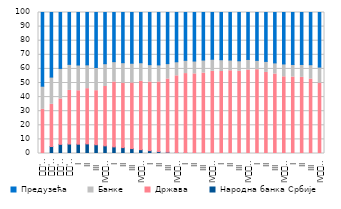
| Category | Народна банка Србије | Држава | Банке | Предузећа |
|---|---|---|---|---|
| 
'08. | 0 | 31.291 | 16.447 | 52.262 |
| 
'09. | 4.984 | 29.887 | 19.325 | 45.804 |
| 
'10. | 6.503 | 32.179 | 21.652 | 39.665 |
| 
'11. | 6.706 | 38.066 | 18.448 | 36.78 |
| I | 6.602 | 37.888 | 18.27 | 37.24 |
| II | 6.814 | 39.174 | 16.883 | 37.129 |
| III | 6.204 | 38.335 | 16.474 | 38.987 |
| IV
2012. | 5.415 | 42.098 | 16.181 | 36.306 |
| I | 4.685 | 46.019 | 14.432 | 34.864 |
| II | 4.172 | 45.685 | 14.545 | 35.598 |
| III | 3.477 | 46.517 | 14.026 | 35.98 |
| IV
2013. | 2.719 | 48.441 | 13.222 | 35.619 |
| I | 2.021 | 48.661 | 12.328 | 36.99 |
| II | 1.323 | 49.383 | 12.132 | 37.162 |
| III | 0.944 | 51.893 | 10.911 | 36.253 |
| IV
2014. | 0.591 | 54.493 | 9.967 | 34.949 |
| I | 0.407 | 56.273 | 9.408 | 33.912 |
| II | 0.194 | 56.26 | 9.127 | 34.418 |
| III | 0.112 | 56.908 | 9.265 | 33.715 |
| IV
2015. | 0.056 | 58.247 | 8.549 | 33.148 |
| I | 0.028 | 58.122 | 8.368 | 33.482 |
| II | 0 | 58.669 | 7.611 | 33.72 |
| III | 0 | 58.285 | 7.49 | 34.225 |
| IV
2016. | 0 | 59.181 | 7.541 | 33.278 |
| I | 0 | 59.435 | 6.62 | 33.944 |
| II | 0 | 57.473 | 7.843 | 34.684 |
| III | 0 | 56.361 | 7.899 | 35.74 |
| IV
2017. | 0 | 54.384 | 9.131 | 36.485 |
| I | 0 | 54.218 | 8.929 | 36.854 |
| II | 0 | 54.004 | 9.148 | 36.848 |
| III | 0 | 52.771 | 10.203 | 37.027 |
| IV
2018. | 0 | 49.898 | 11.402 | 38.699 |